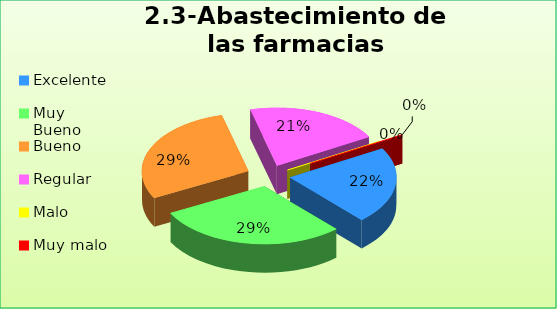
| Category | Series 0 |
|---|---|
| Excelente | 0.216 |
| Muy Bueno | 0.29 |
| Bueno  | 0.287 |
| Regular  | 0.207 |
| Malo  | 0 |
| Muy malo  | 0 |